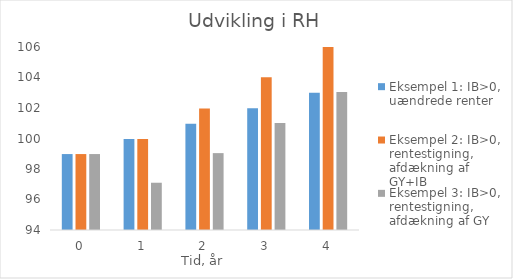
| Category | Eksempel 1: IB>0, uændrede renter | Eksempel 2: IB>0, rentestigning, afdækning af GY+IB | Eksempel 3: IB>0, rentestigning, afdækning af GY |
|---|---|---|---|
| 0.0 | 98.98 | 98.98 | 98.98 |
| 1.0 | 99.97 | 99.97 | 97.099 |
| 2.0 | 100.969 | 101.969 | 99.041 |
| 3.0 | 101.979 | 104.009 | 101.022 |
| 4.0 | 102.999 | 106.089 | 103.043 |